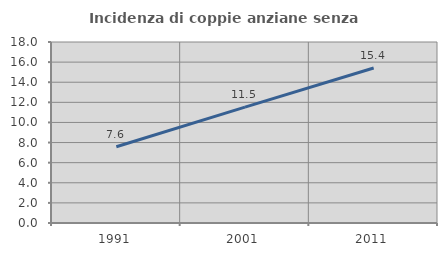
| Category | Incidenza di coppie anziane senza figli  |
|---|---|
| 1991.0 | 7.579 |
| 2001.0 | 11.523 |
| 2011.0 | 15.418 |